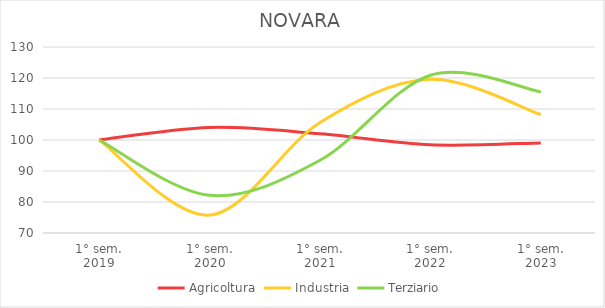
| Category | Agricoltura | Industria | Terziario |
|---|---|---|---|
| 1° sem.
2019 | 100 | 100 | 100 |
| 1° sem.
2020 | 104.05 | 75.779 | 82.161 |
| 1° sem.
2021 | 102.025 | 105.649 | 93.456 |
| 1° sem.
2022 | 98.442 | 119.575 | 120.905 |
| 1° sem.
2023 | 99.065 | 108.209 | 115.528 |